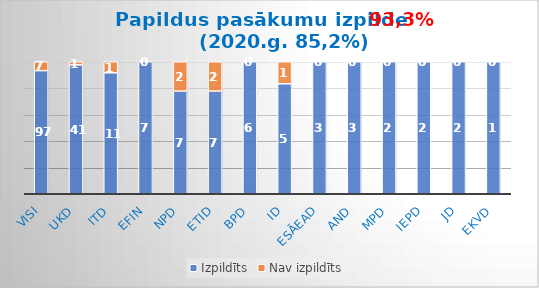
| Category | Izpildīts | Nav izpildīts |
|---|---|---|
| Visi | 97 | 7 |
| UKD | 41 | 1 |
| ITD | 11 | 1 |
| EFIN | 7 | 0 |
| NPD | 7 | 2 |
| ETID | 7 | 2 |
| BPD | 6 | 0 |
| ID | 5 | 1 |
| ESĀEAD | 3 | 0 |
| AND | 3 | 0 |
| MPD | 2 | 0 |
| IEPD | 2 | 0 |
| JD | 2 | 0 |
| EKVD | 1 | 0 |